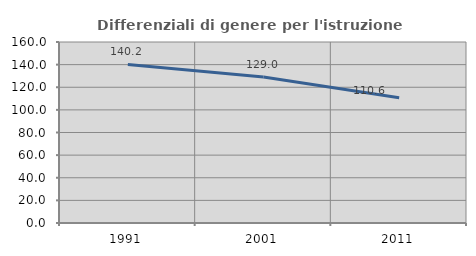
| Category | Differenziali di genere per l'istruzione superiore |
|---|---|
| 1991.0 | 140.192 |
| 2001.0 | 128.994 |
| 2011.0 | 110.639 |